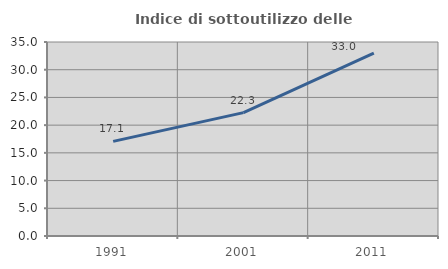
| Category | Indice di sottoutilizzo delle abitazioni  |
|---|---|
| 1991.0 | 17.071 |
| 2001.0 | 22.257 |
| 2011.0 | 33.01 |